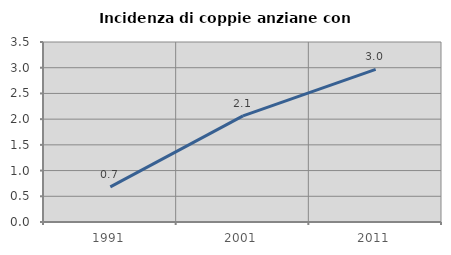
| Category | Incidenza di coppie anziane con figli |
|---|---|
| 1991.0 | 0.682 |
| 2001.0 | 2.064 |
| 2011.0 | 2.969 |